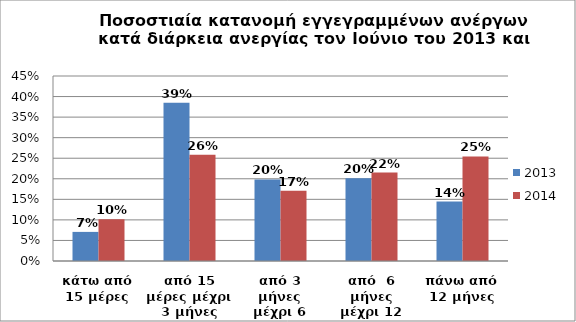
| Category | 2013 | 2014 |
|---|---|---|
| κάτω από 15 μέρες | 0.071 | 0.101 |
| από 15 μέρες μέχρι 3 μήνες | 0.385 | 0.258 |
| από 3 μήνες μέχρι 6 μήνες | 0.198 | 0.171 |
| από  6 μήνες μέχρι 12 μήνες | 0.201 | 0.215 |
| πάνω από 12 μήνες | 0.145 | 0.254 |